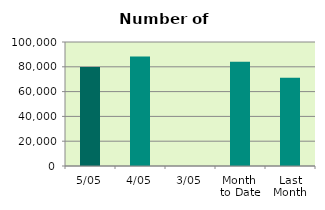
| Category | Series 0 |
|---|---|
| 5/05 | 79744 |
| 4/05 | 88332 |
| 3/05 | 0 |
| Month 
to Date | 84038 |
| Last
Month | 71251.4 |